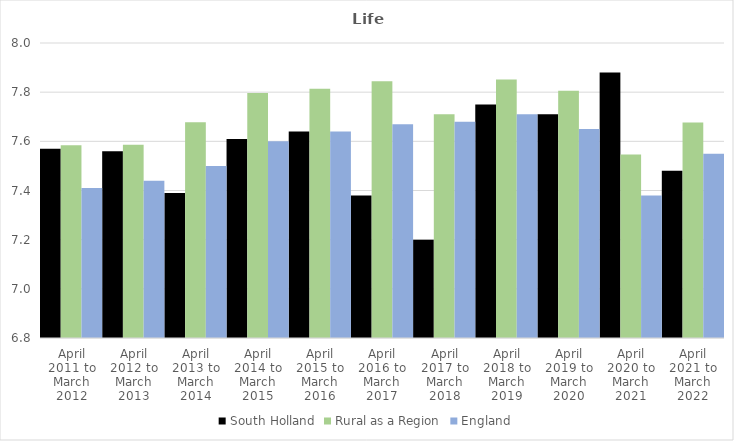
| Category | South Holland | Rural as a Region | England |
|---|---|---|---|
| April 2011 to March 2012 | 7.57 | 7.584 | 7.41 |
| April 2012 to March 2013 | 7.56 | 7.586 | 7.44 |
| April 2013 to March 2014 | 7.39 | 7.677 | 7.5 |
| April 2014 to March 2015 | 7.61 | 7.797 | 7.6 |
| April 2015 to March 2016 | 7.64 | 7.813 | 7.64 |
| April 2016 to March 2017 | 7.38 | 7.845 | 7.67 |
| April 2017 to March 2018 | 7.2 | 7.71 | 7.68 |
| April 2018 to March 2019 | 7.75 | 7.852 | 7.71 |
| April 2019 to March 2020 | 7.71 | 7.806 | 7.65 |
| April 2020 to March 2021 | 7.88 | 7.546 | 7.38 |
| April 2021 to March 2022 | 7.48 | 7.677 | 7.55 |